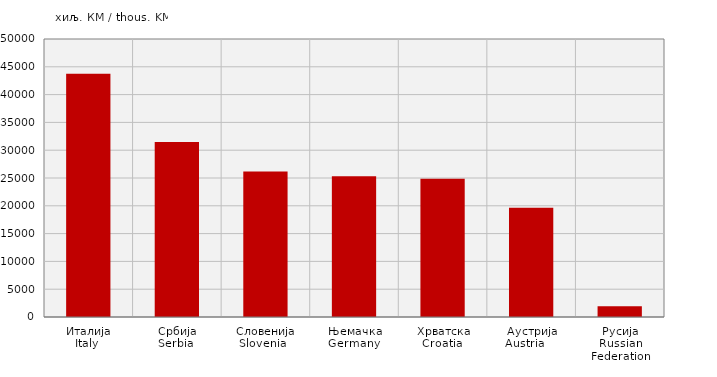
| Category | Извоз
Export |
|---|---|
| Италија
Italy  | 43736 |
| Србија
Serbia  | 31489 |
| Словенија
Slovenia   | 26156 |
| Њемачка
Germany  | 25330 |
| Хрватска
Croatia  | 24878 |
| Аустрија
Austria     | 19648 |
| Русија
Russian Federation | 1953 |